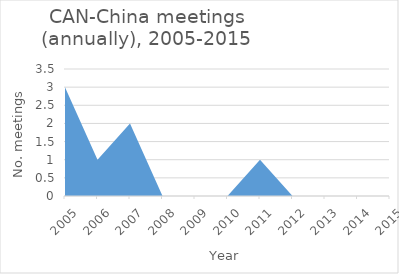
| Category | Number of meetings |
|---|---|
| 2005.0 | 3 |
| 2006.0 | 1 |
| 2007.0 | 2 |
| 2008.0 | 0 |
| 2009.0 | 0 |
| 2010.0 | 0 |
| 2011.0 | 1 |
| 2012.0 | 0 |
| 2013.0 | 0 |
| 2014.0 | 0 |
| 2015.0 | 0 |